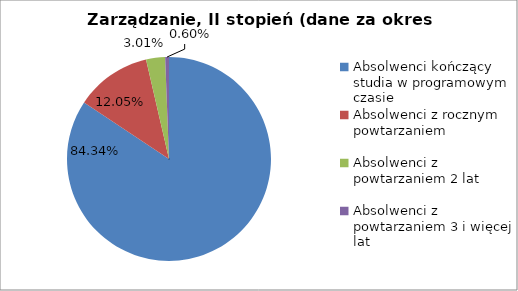
| Category | Series 0 |
|---|---|
| Absolwenci kończący studia w programowym czasie | 84.337 |
| Absolwenci z rocznym powtarzaniem | 12.048 |
| Absolwenci z powtarzaniem 2 lat | 3.012 |
| Absolwenci z powtarzaniem 3 i więcej lat | 0.602 |